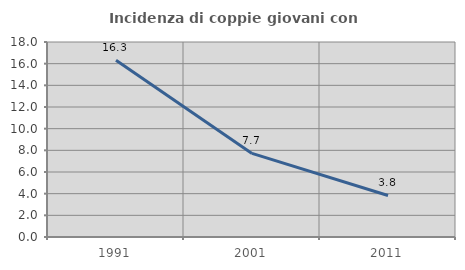
| Category | Incidenza di coppie giovani con figli |
|---|---|
| 1991.0 | 16.317 |
| 2001.0 | 7.713 |
| 2011.0 | 3.834 |